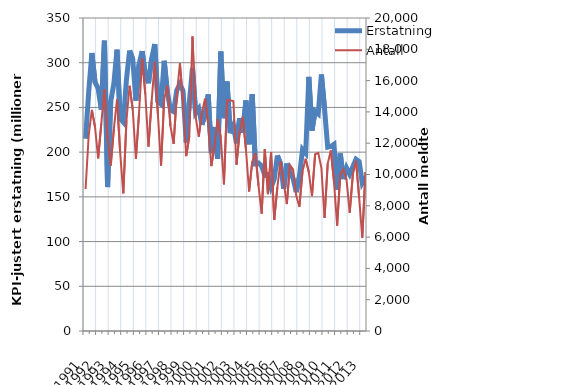
| Category | Erstatning |
|---|---|
| 1991.0 | 215.004 |
| nan | 267.504 |
| nan | 310.899 |
| nan | 278.454 |
| 1992.0 | 271.059 |
| nan | 247.673 |
| nan | 324.574 |
| nan | 160.976 |
| 1993.0 | 256.801 |
| nan | 276.693 |
| nan | 314.577 |
| nan | 237.531 |
| 1994.0 | 233.488 |
| nan | 281.142 |
| nan | 313.591 |
| nan | 304.235 |
| 1995.0 | 257.595 |
| nan | 297.989 |
| nan | 312.93 |
| nan | 286.552 |
| 1996.0 | 277.028 |
| nan | 304.113 |
| nan | 320.864 |
| nan | 256.523 |
| 1997.0 | 253.617 |
| nan | 302.072 |
| nan | 267.373 |
| nan | 247.176 |
| 1998.0 | 245.333 |
| nan | 269.126 |
| nan | 275.966 |
| nan | 268.541 |
| 1999.0 | 210.966 |
| nan | 255.986 |
| nan | 294.196 |
| nan | 244.01 |
| 2000.0 | 248.73 |
| nan | 230.669 |
| nan | 241.961 |
| nan | 264.522 |
| 2001.0 | 198.918 |
| nan | 228.152 |
| nan | 192.663 |
| nan | 312.483 |
| 2002.0 | 237.915 |
| nan | 278.926 |
| nan | 221.198 |
| nan | 229.654 |
| 2003.0 | 209.827 |
| nan | 237.76 |
| nan | 221.701 |
| nan | 257.782 |
| 2004.0 | 208.77 |
| nan | 264.654 |
| nan | 186.983 |
| nan | 187.764 |
| 2005.0 | 184.561 |
| nan | 173.945 |
| nan | 174.667 |
| nan | 160.852 |
| 2006.0 | 169.716 |
| nan | 196.264 |
| nan | 187.186 |
| nan | 159.115 |
| 2007.0 | 187.203 |
| nan | 178.828 |
| nan | 170.552 |
| nan | 155.33 |
| 2008.0 | 172.577 |
| nan | 202.916 |
| nan | 198.861 |
| nan | 284.085 |
| 2009.0 | 224.116 |
| nan | 245.97 |
| nan | 242.891 |
| nan | 286.88 |
| 2010.0 | 248.2 |
| nan | 205.51 |
| nan | 206.354 |
| nan | 208.814 |
| 2011.0 | 157.942 |
| nan | 198.404 |
| nan | 169.886 |
| nan | 182.352 |
| 2012.0 | 175.337 |
| nan | 183.788 |
| nan | 192.075 |
| nan | 189.552 |
| 2013.0 | 165.829 |
| nan | 172.363 |